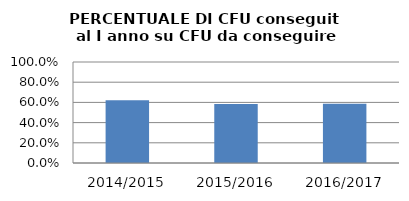
| Category | 2014/2015 2015/2016 2016/2017 |
|---|---|
| 2014/2015 | 0.622 |
| 2015/2016 | 0.585 |
| 2016/2017 | 0.586 |